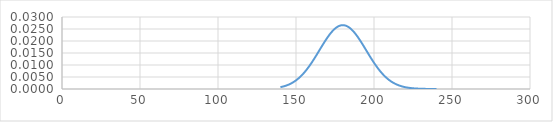
| Category | Series 0 |
|---|---|
| 140.0 | 0.001 |
| 141.0 | 0.001 |
| 142.0 | 0.001 |
| 143.0 | 0.001 |
| 144.0 | 0.001 |
| 145.0 | 0.002 |
| 146.0 | 0.002 |
| 147.0 | 0.002 |
| 148.0 | 0.003 |
| 149.0 | 0.003 |
| 150.0 | 0.004 |
| 151.0 | 0.004 |
| 152.0 | 0.005 |
| 153.0 | 0.005 |
| 154.0 | 0.006 |
| 155.0 | 0.007 |
| 156.0 | 0.007 |
| 157.0 | 0.008 |
| 158.0 | 0.009 |
| 159.0 | 0.01 |
| 160.0 | 0.011 |
| 161.0 | 0.012 |
| 162.0 | 0.013 |
| 163.0 | 0.014 |
| 164.0 | 0.015 |
| 165.0 | 0.016 |
| 166.0 | 0.017 |
| 167.0 | 0.018 |
| 168.0 | 0.019 |
| 169.0 | 0.02 |
| 170.0 | 0.021 |
| 171.0 | 0.022 |
| 172.0 | 0.023 |
| 173.0 | 0.024 |
| 174.0 | 0.025 |
| 175.0 | 0.025 |
| 176.0 | 0.026 |
| 177.0 | 0.026 |
| 178.0 | 0.026 |
| 179.0 | 0.027 |
| 180.0 | 0.027 |
| 181.0 | 0.027 |
| 182.0 | 0.026 |
| 183.0 | 0.026 |
| 184.0 | 0.026 |
| 185.0 | 0.025 |
| 186.0 | 0.025 |
| 187.0 | 0.024 |
| 188.0 | 0.023 |
| 189.0 | 0.022 |
| 190.0 | 0.021 |
| 191.0 | 0.02 |
| 192.0 | 0.019 |
| 193.0 | 0.018 |
| 194.0 | 0.017 |
| 195.0 | 0.016 |
| 196.0 | 0.015 |
| 197.0 | 0.014 |
| 198.0 | 0.013 |
| 199.0 | 0.012 |
| 200.0 | 0.011 |
| 201.0 | 0.01 |
| 202.0 | 0.009 |
| 203.0 | 0.008 |
| 204.0 | 0.007 |
| 205.0 | 0.007 |
| 206.0 | 0.006 |
| 207.0 | 0.005 |
| 208.0 | 0.005 |
| 209.0 | 0.004 |
| 210.0 | 0.004 |
| 211.0 | 0.003 |
| 212.0 | 0.003 |
| 213.0 | 0.002 |
| 214.0 | 0.002 |
| 215.0 | 0.002 |
| 216.0 | 0.001 |
| 217.0 | 0.001 |
| 218.0 | 0.001 |
| 219.0 | 0.001 |
| 220.0 | 0.001 |
| 221.0 | 0.001 |
| 222.0 | 0.001 |
| 223.0 | 0 |
| 224.0 | 0 |
| 225.0 | 0 |
| 226.0 | 0 |
| 227.0 | 0 |
| 228.0 | 0 |
| 229.0 | 0 |
| 230.0 | 0 |
| 231.0 | 0 |
| 232.0 | 0 |
| 233.0 | 0 |
| 234.0 | 0 |
| 235.0 | 0 |
| 236.0 | 0 |
| 237.0 | 0 |
| 238.0 | 0 |
| 239.0 | 0 |
| 240.0 | 0 |